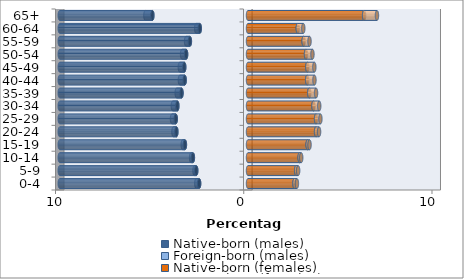
| Category | Native-born (males) | Foreign-born (males) | Native-born (females) | Foreign-born (females) |
|---|---|---|---|---|
| 0-4 | -2.596 | -0.15 | 2.468 | 0.13 |
| 5-9 | -2.75 | -0.093 | 2.559 | 0.105 |
| 10-14 | -2.928 | -0.094 | 2.742 | 0.085 |
| 15-19 | -3.351 | -0.116 | 3.167 | 0.101 |
| 20-24 | -3.805 | -0.156 | 3.616 | 0.16 |
| 25-29 | -3.838 | -0.199 | 3.615 | 0.232 |
| 30-34 | -3.754 | -0.239 | 3.477 | 0.307 |
| 35-39 | -3.533 | -0.254 | 3.254 | 0.362 |
| 40-44 | -3.364 | -0.254 | 3.143 | 0.387 |
| 45-49 | -3.388 | -0.234 | 3.151 | 0.373 |
| 50-54 | -3.288 | -0.213 | 3.082 | 0.342 |
| 55-59 | -3.087 | -0.201 | 2.955 | 0.312 |
| 60-64 | -2.562 | -0.19 | 2.644 | 0.293 |
| 65+ | -5.082 | -0.369 | 6.168 | 0.683 |